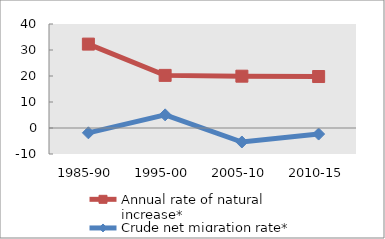
| Category | Annual rate of natural increase* | Crude net migration rate* |
|---|---|---|
| 1985-90 | 32.27 | -1.854 |
| 1995-00 | 20.239 | 5.051 |
| 2005-10 | 19.933 | -5.381 |
| 2010-15 | 19.8 | -2.33 |